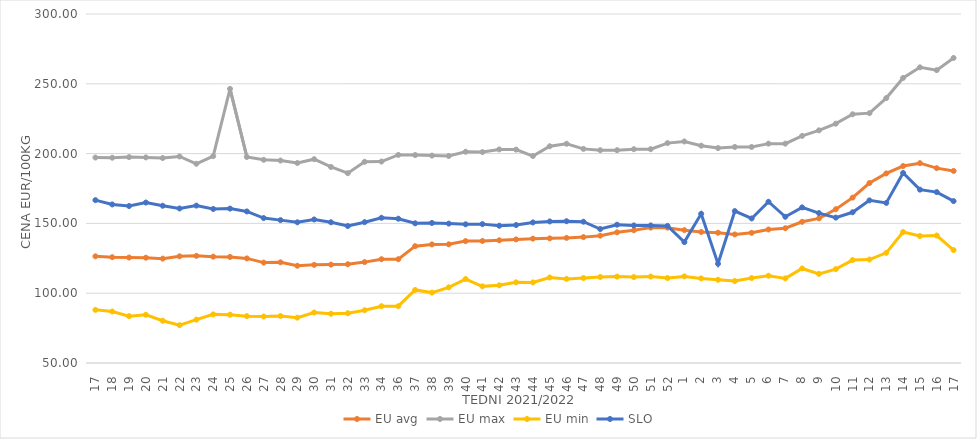
| Category | EU avg | EU max | EU min | SLO |
|---|---|---|---|---|
| 17.0 | 126.415 | 197.188 | 88.07 | 166.66 |
| 18.0 | 125.787 | 197.055 | 86.89 | 163.58 |
| 19.0 | 125.54 | 197.478 | 83.546 | 162.44 |
| 20.0 | 125.412 | 197.263 | 84.55 | 164.94 |
| 21.0 | 124.768 | 196.821 | 80.264 | 162.64 |
| 22.0 | 126.43 | 197.963 | 77.048 | 160.68 |
| 23.0 | 126.76 | 192.72 | 81.087 | 162.75 |
| 24.0 | 126.19 | 198.186 | 84.83 | 160.34 |
| 25.0 | 125.97 | 246.36 | 84.63 | 160.6 |
| 26.0 | 124.92 | 197.607 | 83.57 | 158.57 |
| 27.0 | 121.922 | 195.566 | 83.3 | 153.83 |
| 28.0 | 122.106 | 195.043 | 83.64 | 152.35 |
| 29.0 | 119.659 | 193.272 | 82.49 | 150.79 |
| 30.0 | 120.3 | 196.01 | 86.16 | 152.82 |
| 31.0 | 120.473 | 190.42 | 85.26 | 150.8 |
| 32.0 | 120.756 | 186 | 85.65 | 148.1 |
| 33.0 | 122.274 | 194.145 | 87.8 | 150.88 |
| 34.0 | 124.332 | 194.304 | 90.69 | 154.04 |
| 36.0 | 124.332 | 199.06 | 90.69 | 153.37 |
| 37.0 | 133.685 | 198.97 | 102.334 | 150.06 |
| 38.0 | 134.959 | 198.57 | 100.43 | 150.32 |
| 39.0 | 135.021 | 198.3 | 104.21 | 149.86 |
| 40.0 | 137.315 | 201.34 | 110.15 | 149.34 |
| 41.0 | 137.411 | 201.081 | 104.9 | 149.48 |
| 42.0 | 137.908 | 202.98 | 105.65 | 148.32 |
| 43.0 | 138.52 | 202.856 | 107.8 | 148.83 |
| 44.0 | 139.076 | 198.26 | 107.75 | 150.69 |
| 45.0 | 139.275 | 205.257 | 111.25 | 151.41 |
| 46.0 | 139.626 | 207.046 | 110.26 | 151.56 |
| 47.0 | 140.17 | 203.387 | 110.83 | 151.2 |
| 48.0 | 141.2 | 202.42 | 111.62 | 145.97 |
| 49.0 | 143.614 | 202.45 | 111.89 | 149.07 |
| 50.0 | 145.101 | 203.17 | 111.54 | 148.55 |
| 51.0 | 146.984 | 203.17 | 111.93 | 148.54 |
| 52.0 | 146.958 | 207.5 | 110.85 | 148.22 |
| 1.0 | 145.157 | 208.7 | 112.04 | 136.59 |
| 2.0 | 143.842 | 205.67 | 110.59 | 156.88 |
| 3.0 | 143.324 | 203.97 | 109.62 | 121.07 |
| 4.0 | 142.105 | 204.76 | 108.71 | 158.82 |
| 5.0 | 143.269 | 204.76 | 110.86 | 153.55 |
| 6.0 | 145.648 | 207.14 | 112.52 | 165.51 |
| 7.0 | 146.545 | 207.14 | 110.619 | 154.74 |
| 8.0 | 151.148 | 212.7 | 117.709 | 161.48 |
| 9.0 | 153.62 | 216.67 | 113.871 | 157.38 |
| 10.0 | 160.142 | 221.43 | 117.233 | 154.16 |
| 11.0 | 168.465 | 228.17 | 123.737 | 157.96 |
| 12.0 | 178.919 | 228.97 | 124.105 | 166.49 |
| 13.0 | 185.792 | 239.77 | 128.918 | 164.66 |
| 14.0 | 191.103 | 254.21 | 143.85 | 186.11 |
| 15.0 | 193.148 | 261.79 | 140.954 | 174.18 |
| 16.0 | 189.581 | 259.76 | 141.337 | 172.42 |
| 17.0 | 187.592 | 268.52 | 130.897 | 165.96 |